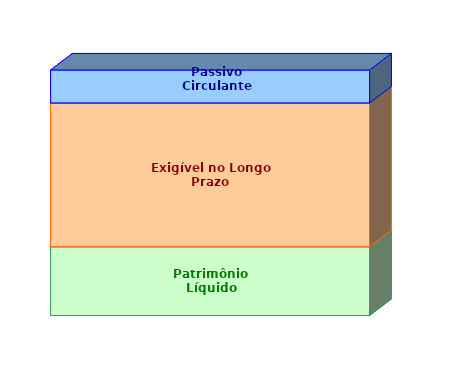
| Category | Patrimônio Líquido | Exigível no Longo Prazo | Passivo Circulante |
|---|---|---|---|
| 0 | 0.28 | 0.586 | 0.134 |